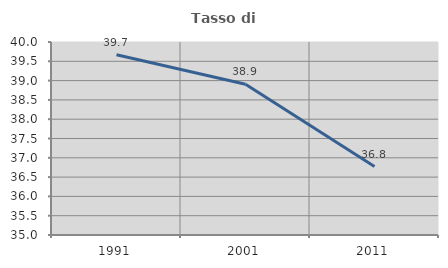
| Category | Tasso di occupazione   |
|---|---|
| 1991.0 | 39.669 |
| 2001.0 | 38.904 |
| 2011.0 | 36.774 |